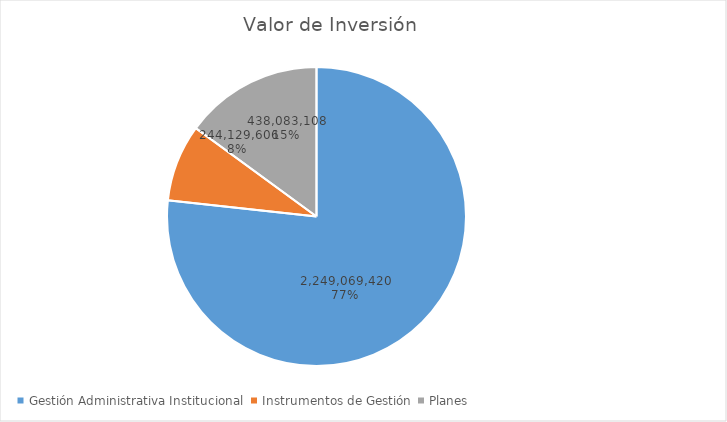
| Category | Valor de Inversión | Porcentaje de Ejecución dentro de la Actividad |
|---|---|---|
| Gestión Administrativa Institucional | 2249069420 | 8 |
| Instrumentos de Gestión | 244129606 | 2 |
| Planes | 438083108 | 4 |